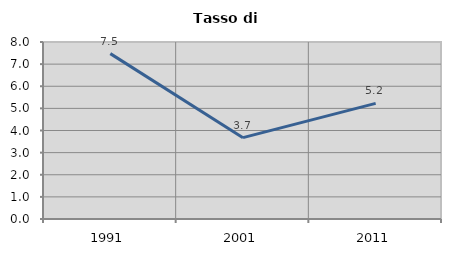
| Category | Tasso di disoccupazione   |
|---|---|
| 1991.0 | 7.475 |
| 2001.0 | 3.677 |
| 2011.0 | 5.225 |